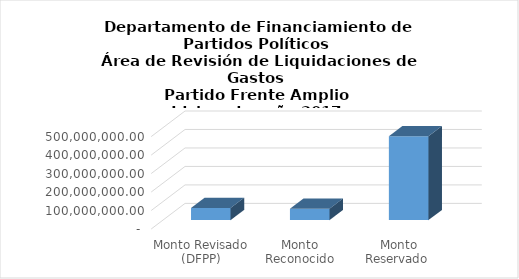
| Category | Series 0 |
|---|---|
| Monto Revisado (DFPP) | 65804065.59 |
| Monto Reconocido (TSE) | 62147689.46 |
| Monto Reservado  | 453652965.18 |